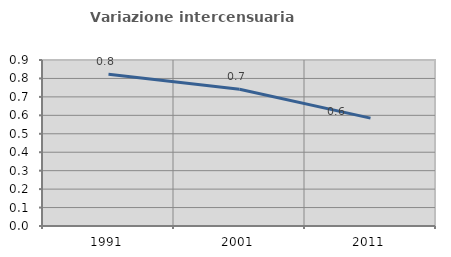
| Category | Variazione intercensuaria annua |
|---|---|
| 1991.0 | 0.822 |
| 2001.0 | 0.742 |
| 2011.0 | 0.585 |